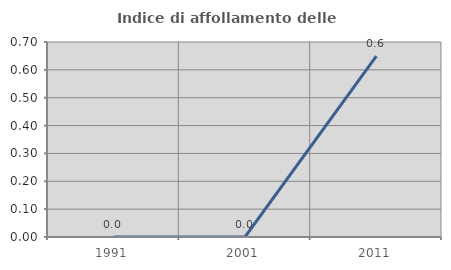
| Category | Indice di affollamento delle abitazioni  |
|---|---|
| 1991.0 | 0 |
| 2001.0 | 0 |
| 2011.0 | 0.649 |